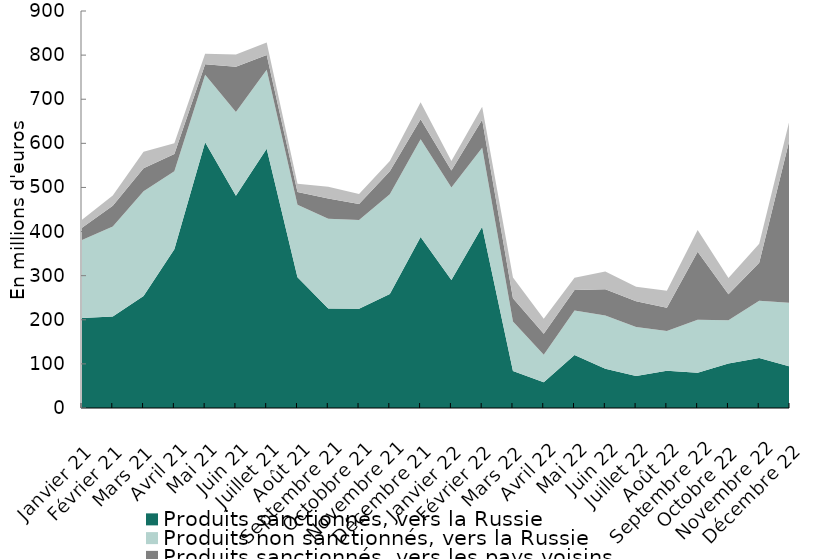
| Category | Produits sanctionnés, vers la Russie | Produits non sanctionnés, vers la Russie | Produits sanctionnés, vers les pays voisins | Produits non sanctionnés,  vers les pays voisins |
|---|---|---|---|---|
| Janvier 21 | 203.809 | 176.84 | 27.704 | 18.507 |
| Février 21 | 207.695 | 203.9 | 46.786 | 23.563 |
| Mars 21 | 253.741 | 237.46 | 52.54 | 36.921 |
| Avril 21 | 359.943 | 176.601 | 39.238 | 24.136 |
| Mai 21 | 602.429 | 152.794 | 23.995 | 24.074 |
| Juin 21 | 481.097 | 190.012 | 102.386 | 27.661 |
| Juillet 21 | 587.639 | 179.014 | 33.599 | 28.411 |
| Août 21 | 296.43 | 164.569 | 28.689 | 18.43 |
| Septembre 21 | 225.317 | 203.85 | 45.551 | 26.725 |
| Octobbre 21 | 225.15 | 201.11 | 36.119 | 22.965 |
| Novembre 21 | 258.247 | 226.521 | 51.961 | 23.09 |
| Décembre 21 | 387.43 | 222.103 | 44.848 | 38.896 |
| Janvier 22 | 290.328 | 209.535 | 38.586 | 21.475 |
| Février 22 | 411.096 | 178.945 | 63.505 | 29.155 |
| Mars 22 | 83.725 | 112.204 | 52.776 | 47.193 |
| Avril 22 | 58.658 | 62.189 | 47.451 | 33.753 |
| Mai 22 | 119.911 | 101.028 | 46.511 | 28.036 |
| Juin 22 | 89.255 | 120.668 | 59.048 | 40.25 |
| Juillet 22 | 72.549 | 111.044 | 58.177 | 33.336 |
| Août 22 | 84.453 | 90.026 | 52.888 | 38.492 |
| Septembre 22 | 80.052 | 120.214 | 153.796 | 49.522 |
| Octobre 22 | 101.003 | 98.056 | 58.663 | 36.948 |
| Novembre 22 | 113.632 | 129.574 | 85.8 | 43.594 |
| Décembre 22 | 94.025 | 144.537 | 374.524 | 43.565 |